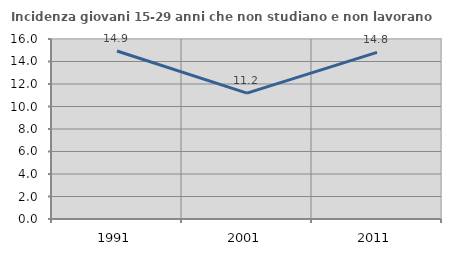
| Category | Incidenza giovani 15-29 anni che non studiano e non lavorano  |
|---|---|
| 1991.0 | 14.931 |
| 2001.0 | 11.19 |
| 2011.0 | 14.806 |